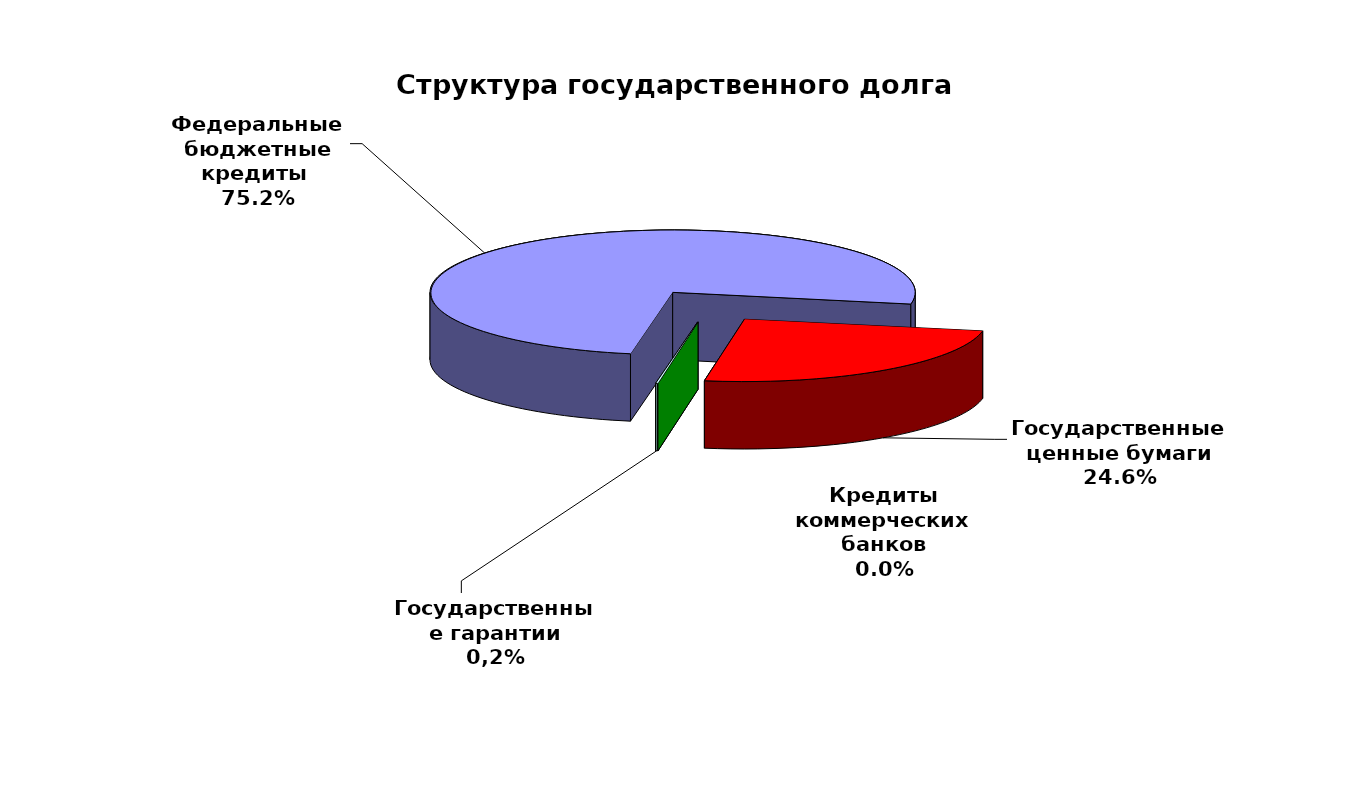
| Category | Series 0 |
|---|---|
| Федеральные бюджетные кредиты  | 103839945.713 |
| Государственные ценные бумаги | 34000000 |
| Кредиты коммерческих банков | 0 |
| Государственные гарантии | 192112.881 |